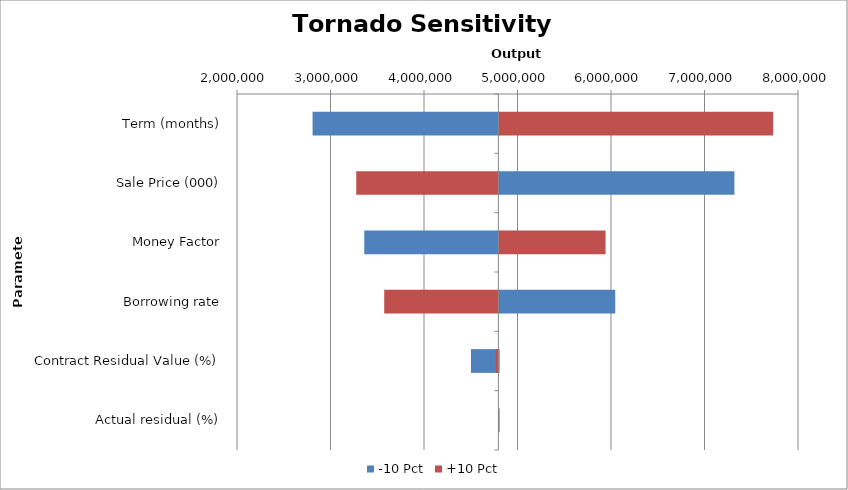
| Category | -10 Pct | +10 Pct |
|---|---|---|
| Term (months) | 2808300.383 | 7723152.325 |
| Sale Price (000) | 7309031.563 | 3275360.705 |
| Money Factor | 3361128.418 | 5931207.623 |
| Borrowing rate | 6034374.354 | 3574497.988 |
| Contract Residual Value (%) | 4502171.588 | 4764066.182 |
| Actual residual (%) | 4795455.609 | 4795455.609 |